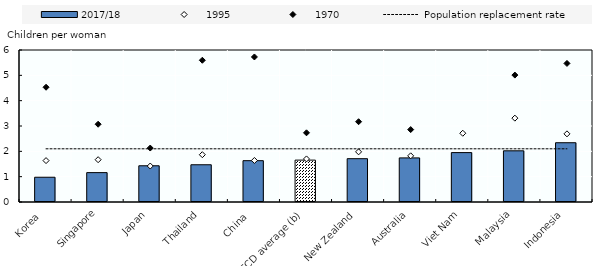
| Category | 2017/18 |
|---|---|
| Korea  | 0.977 |
| Singapore | 1.16 |
| Japan | 1.43 |
| Thailand | 1.47 |
| China  | 1.631 |
| OECD average (b) | 1.653 |
| New Zealand | 1.71 |
| Australia | 1.741 |
| Viet Nam | 1.95 |
| Malaysia | 2.02 |
| Indonesia | 2.34 |